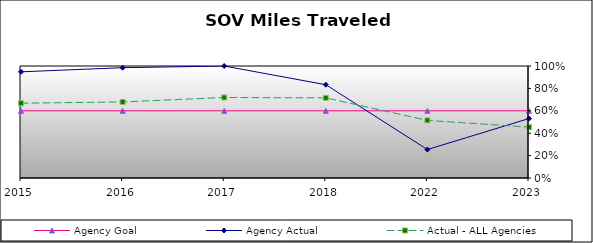
| Category | Agency Goal | Agency Actual | Actual - ALL Agencies |
|---|---|---|---|
| 2015.0 | 0.6 | 0.948 | 0.668 |
| 2016.0 | 0.6 | 0.985 | 0.679 |
| 2017.0 | 0.6 | 1 | 0.719 |
| 2018.0 | 0.6 | 0.833 | 0.715 |
| 2022.0 | 0.6 | 0.254 | 0.515 |
| 2023.0 | 0.6 | 0.531 | 0.454 |